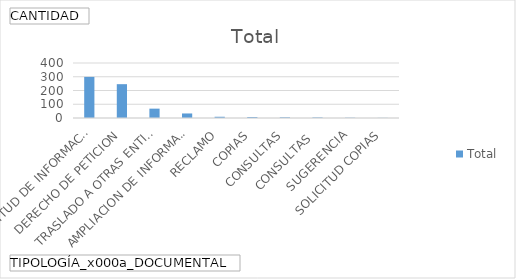
| Category | Total |
|---|---|
| SOLICITUD DE INFORMACION | 299 |
| DERECHO DE PETICION | 246 |
| TRASLADO A OTRAS ENTIDADES | 68 |
| AMPLIACION DE INFORMACION | 33 |
| RECLAMO | 9 |
| COPIAS | 7 |
| CONSULTAS | 5 |
| CONSULTAS  | 4 |
| SUGERENCIA | 2 |
| SOLICITUD COPIAS | 1 |